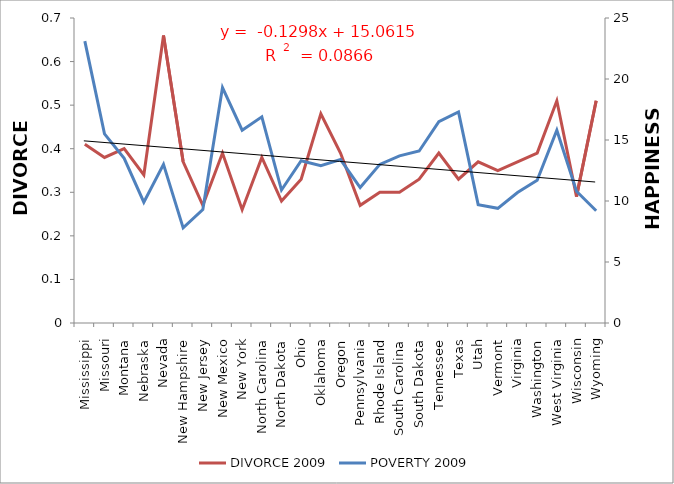
| Category | DIVORCE 2009 |
|---|---|
| Mississippi | 0.41 |
| Missouri | 0.38 |
| Montana | 0.4 |
| Nebraska | 0.34 |
| Nevada | 0.66 |
| New Hampshire | 0.37 |
| New Jersey | 0.27 |
| New Mexico | 0.39 |
| New York | 0.26 |
| North Carolina | 0.38 |
| North Dakota | 0.28 |
| Ohio | 0.33 |
| Oklahoma | 0.48 |
| Oregon | 0.39 |
| Pennsylvania | 0.27 |
| Rhode Island | 0.3 |
| South Carolina | 0.3 |
| South Dakota | 0.33 |
| Tennessee | 0.39 |
| Texas | 0.33 |
| Utah | 0.37 |
| Vermont | 0.35 |
| Virginia | 0.37 |
| Washington | 0.39 |
| West Virginia | 0.51 |
| Wisconsin | 0.29 |
| Wyoming | 0.51 |